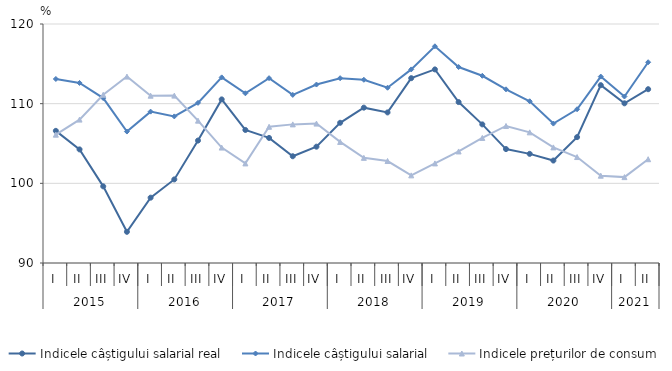
| Category | Indicele câștigului salarial real | Indicele câștigului salarial | Indicele prețurilor de consum |
|---|---|---|---|
| 0 | 106.588 | 113.1 | 106.11 |
| 1 | 104.259 | 112.6 | 108 |
| 2 | 99.622 | 110.7 | 111.12 |
| 3 | 93.915 | 106.5 | 113.4 |
| 4 | 98.2 | 109 | 111 |
| 5 | 100.491 | 108.4 | 111.01 |
| 6 | 105.369 | 110.1 | 107.87 |
| 7 | 110.537 | 113.3 | 104.49 |
| 8 | 106.7 | 111.3 | 102.5 |
| 9 | 105.7 | 113.2 | 107.1 |
| 10 | 103.4 | 111.1 | 107.4 |
| 11 | 104.6 | 112.4 | 107.5 |
| 12 | 107.6 | 113.2 | 105.2 |
| 13 | 109.5 | 113 | 103.2 |
| 14 | 108.9 | 112 | 102.8 |
| 15 | 113.2 | 114.3 | 101 |
| 16 | 114.3 | 117.2 | 102.5 |
| 17 | 110.2 | 114.6 | 104 |
| 18 | 107.4 | 113.5 | 105.7 |
| 19 | 104.3 | 111.8 | 107.2 |
| 20 | 103.7 | 110.3 | 106.4 |
| 21 | 102.861 | 107.5 | 104.51 |
| 22 | 105.8 | 109.3 | 103.3 |
| 23 | 112.322 | 113.4 | 100.96 |
| 24 | 110.042 | 110.9 | 100.78 |
| 25 | 111.816 | 115.2 | 103.026 |